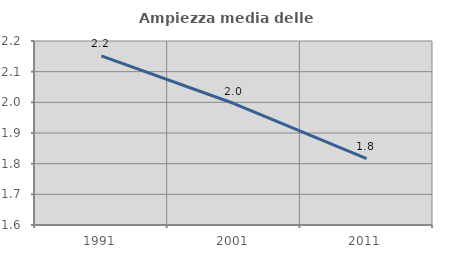
| Category | Ampiezza media delle famiglie |
|---|---|
| 1991.0 | 2.152 |
| 2001.0 | 1.996 |
| 2011.0 | 1.816 |